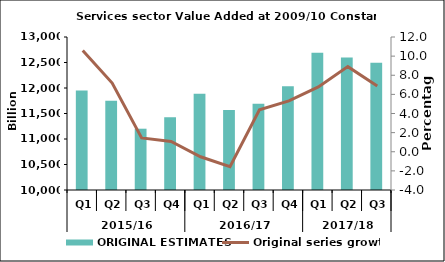
| Category | ORIGINAL ESTIMATES |
|---|---|
| 0 | 11948.615 |
| 1 | 11752.206 |
| 2 | 11201.86 |
| 3 | 11426.635 |
| 4 | 11886.076 |
| 5 | 11568.527 |
| 6 | 11692.774 |
| 7 | 12034.638 |
| 8 | 12691.37 |
| 9 | 12598.333 |
| 10 | 12497.053 |